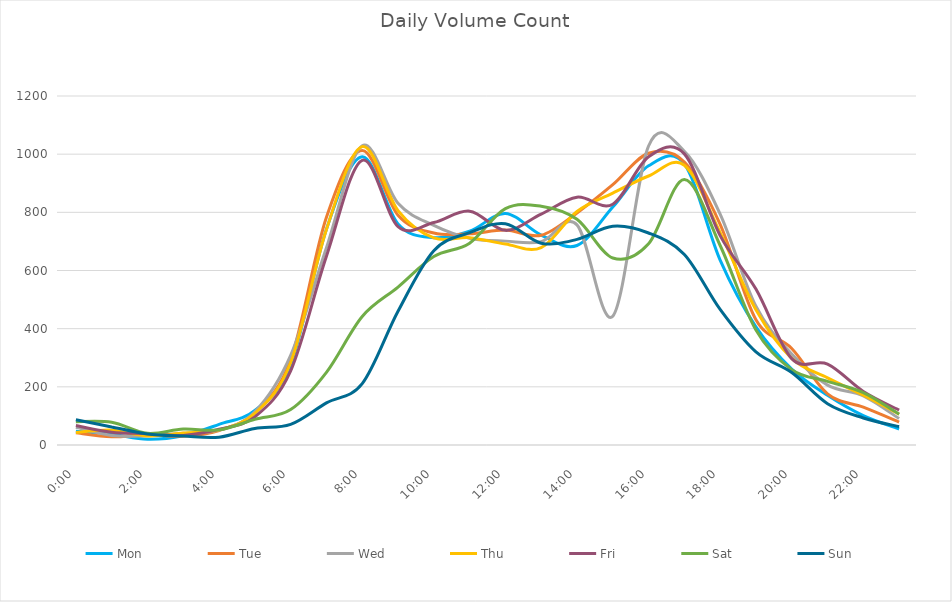
| Category | Mon | Tue | Wed | Thu | Fri | Sat | Sun |
|---|---|---|---|---|---|---|---|
| 0.0 | 47 | 42 | 61 | 43 | 67 | 80 | 87 |
| 0.0416666666666667 | 37 | 28 | 33 | 51 | 44 | 78 | 62 |
| 0.0833333333333333 | 20 | 36 | 32 | 31 | 39 | 40 | 38 |
| 0.125 | 32 | 30 | 40 | 41 | 33 | 55 | 31 |
| 0.166666666666667 | 71 | 50 | 51 | 52 | 54 | 52 | 27 |
| 0.208333333333333 | 119 | 111 | 114 | 109 | 97 | 88 | 57 |
| 0.25 | 276 | 293 | 308 | 283 | 255 | 122 | 71 |
| 0.291666666666667 | 742 | 783 | 678 | 741 | 649 | 250 | 145 |
| 0.333333333333333 | 991 | 1013 | 1029 | 1026 | 979 | 442 | 211 |
| 0.375 | 760 | 790 | 831 | 806 | 751 | 543 | 460 |
| 0.416666666666667 | 713 | 729 | 755 | 712 | 765 | 648 | 668 |
| 0.4583333333333333 | 735 | 726 | 711 | 713 | 804 | 694 | 730 |
| 0.5 | 796 | 739 | 701 | 691 | 738 | 813 | 761 |
| 0.541666666666667 | 722 | 721 | 699 | 679 | 794 | 821 | 694 |
| 0.5833333333333334 | 686 | 798 | 757 | 803 | 852 | 776 | 707 |
| 0.625 | 818 | 895 | 443 | 866 | 828 | 643 | 752 |
| 0.666666666666667 | 960 | 1003 | 1028 | 925 | 991 | 692 | 729 |
| 0.7083333333333334 | 966 | 973 | 1010 | 962 | 1001 | 913 | 655 |
| 0.75 | 636 | 759 | 794 | 730 | 720 | 686 | 466 |
| 0.791666666666667 | 406 | 431 | 477 | 465 | 536 | 395 | 320 |
| 0.8333333333333334 | 261 | 332 | 313 | 298 | 297 | 259 | 249 |
| 0.875 | 171 | 176 | 206 | 231 | 278 | 219 | 142 |
| 0.916666666666667 | 101 | 130 | 169 | 171 | 184 | 180 | 93 |
| 0.9583333333333334 | 55 | 79 | 91 | 106 | 120 | 106 | 63 |